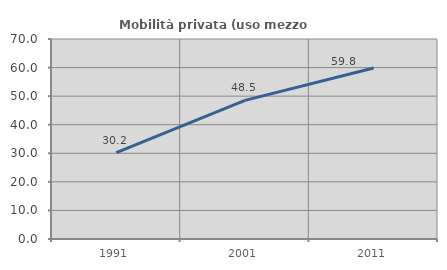
| Category | Mobilità privata (uso mezzo privato) |
|---|---|
| 1991.0 | 30.196 |
| 2001.0 | 48.527 |
| 2011.0 | 59.826 |